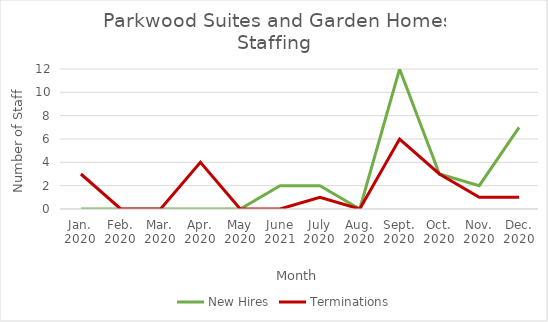
| Category | New Hires | Terminations |
|---|---|---|
| Jan.
2020 | 0 | 3 |
| Feb.
2020 | 0 | 0 |
| Mar.
2020 | 0 | 0 |
| Apr.
2020 | 0 | 4 |
| May
2020 | 0 | 0 |
| June
2021 | 2 | 0 |
| July
2020 | 2 | 1 |
| Aug.
2020 | 0 | 0 |
| Sept.
2020 | 12 | 6 |
| Oct.
2020 | 3 | 3 |
| Nov.
2020 | 2 | 1 |
| Dec.
2020 | 7 | 1 |